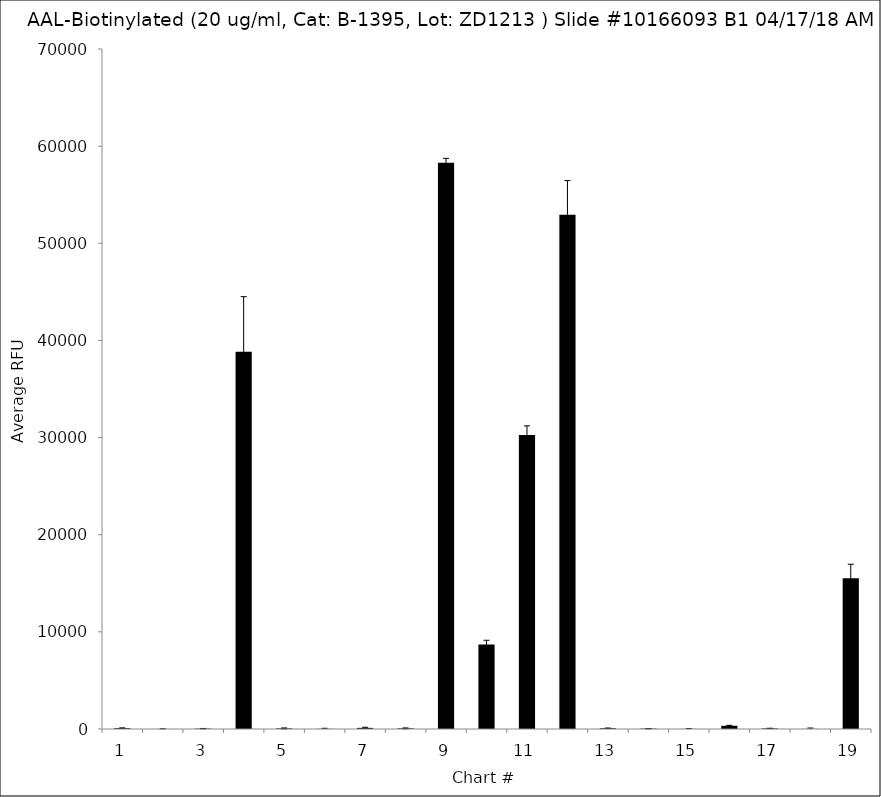
| Category | Series 0 |
|---|---|
| 1.0 | 86.25 |
| 2.0 | 5.75 |
| 3.0 | 39 |
| 4.0 | 38827.75 |
| 5.0 | 62.5 |
| 6.0 | 20 |
| 7.0 | 116 |
| 8.0 | 67.5 |
| 9.0 | 58295 |
| 10.0 | 8689 |
| 11.0 | 30270 |
| 12.0 | 52946 |
| 13.0 | 78.25 |
| 14.0 | 37.5 |
| 15.0 | 9.25 |
| 16.0 | 330.5 |
| 17.0 | 59.5 |
| 18.0 | 11 |
| 19.0 | 15528.75 |